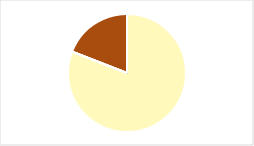
| Category | Series 0 |
|---|---|
| 0 | 0 |
| 1 | 0.809 |
| 2 | 0 |
| 3 | 0 |
| 4 | 0.191 |